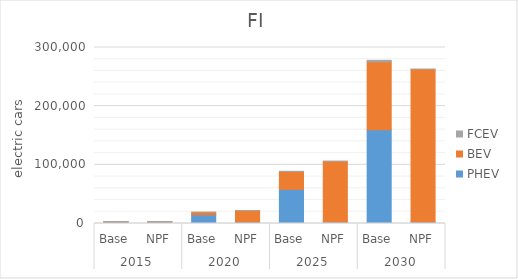
| Category | PHEV | BEV | FCEV |
|---|---|---|---|
| 0 | 2636.987 | 618.381 | 3.149 |
| 1 | 2636.987 | 618.381 | 3.149 |
| 2 | 14775.668 | 4368.874 | 13.547 |
| 3 | 2636.987 | 19359.864 | 3.149 |
| 4 | 58187.569 | 30499.879 | 306.339 |
| 5 | 2636.987 | 103359.864 | 3.149 |
| 6 | 159880.556 | 115761.48 | 2451.528 |
| 7 | 2636.987 | 260359.864 | 3.149 |